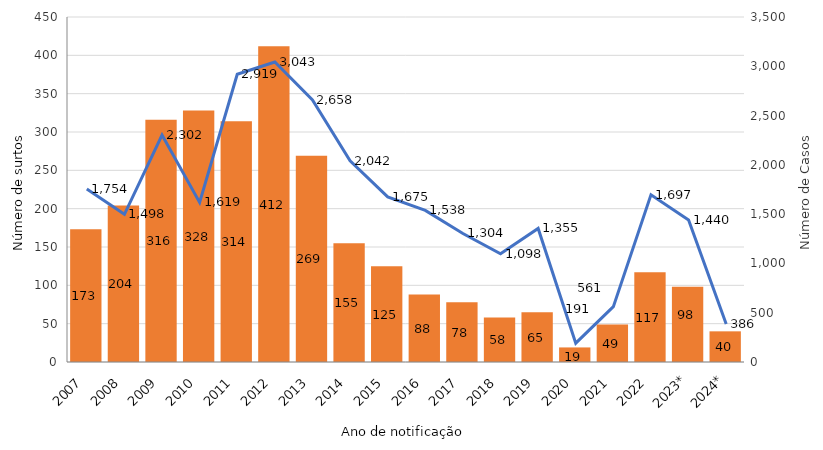
| Category | Series 1 |
|---|---|
| 2007 | 173 |
| 2008 | 204 |
| 2009 | 316 |
| 2010 | 328 |
| 2011 | 314 |
| 2012 | 412 |
| 2013 | 269 |
| 2014 | 155 |
| 2015 | 125 |
| 2016 | 88 |
| 2017 | 78 |
| 2018 | 58 |
| 2019 | 65 |
| 2020 | 19 |
| 2021 | 49 |
| 2022 | 117 |
| 2023* | 98 |
| 2024* | 40 |